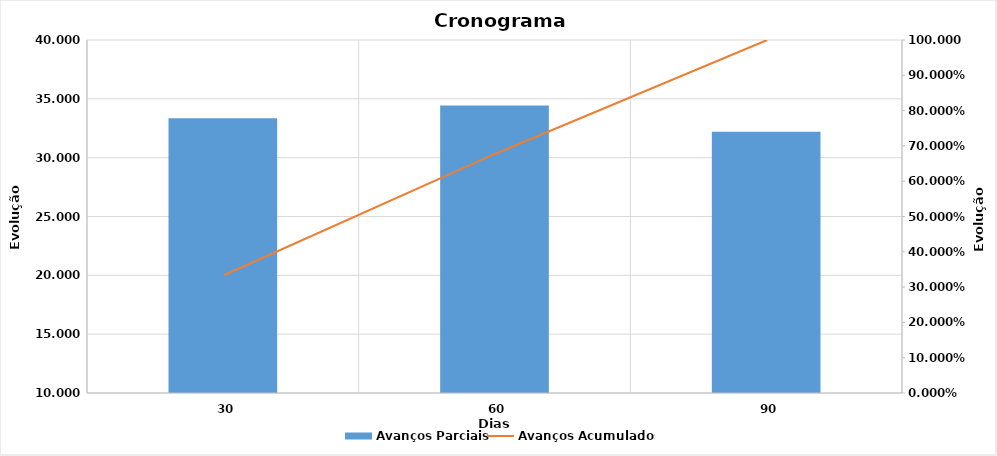
| Category | Avanços Parciais |
|---|---|
| 30.0 | 0.334 |
| 60.0 | 0.344 |
| 90.0 | 0.322 |